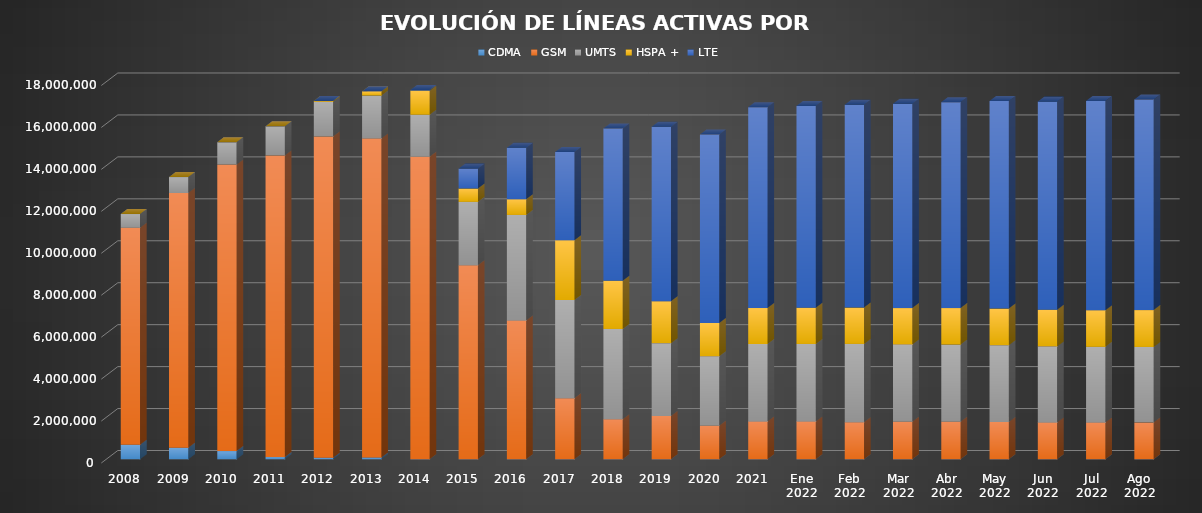
| Category | CDMA | GSM | UMTS | HSPA + | LTE |
|---|---|---|---|---|---|
| 2008 | 688357 | 10346902 | 656989 | 0 | 0 |
| 2009 | 544313 | 12151710 | 758577 | 0 | 0 |
| 2010 | 389834 | 13657394 | 1071603 | 0 | 0 |
| 2011 | 102115 | 14379423 | 1393020 | 0 | 0 |
| 2012 | 75179 | 15310006 | 1658596 | 43082 | 0 |
| 2013 | 83748 | 15215287 | 2043321 | 199398 | 0 |
| 2014 | 3009 | 14418144 | 2006405 | 1148823 | 28176 |
| 2015 | 0 | 9252920 | 3019889 | 636488 | 949723 |
| 2016 | 0 | 6621574 | 5027714 | 748032 | 2450814 |
| 2017 | 0 | 2903370.634 | 4688270.066 | 2852941.199 | 4206822.101 |
| 2018 | 0 | 1909938.891 | 4302462.415 | 2301651 | 7258785.694 |
| 2019 | 0 | 2068130.505 | 3468519.705 | 1995507 | 8320942.79 |
| 2020 | 0 | 1595680.621 | 3315009.099 | 1591073 | 8983603.28 |
| 2021 | 0 | 1804531 | 3688873 | 1717066 | 9579130 |
| Ene 2022 | 0 | 1805568.915 | 3691993.367 | 1724655 | 9625971.718 |
| Feb 2022 | 0 | 1766433.449 | 3732997.987 | 1730603 | 9675803.564 |
| Mar 2022 | 0 | 1788524.686 | 3683797.748 | 1734523 | 9742847.566 |
| Abr 2022 | 0 | 1787551.615 | 3681280.387 | 1738734 | 9820230.999 |
| May 2022 | 0 | 1778055.41 | 3660016.984 | 1744330 | 9902399.607 |
| Jun 2022 | 0 | 1757626.897 | 3624197.892 | 1745386 | 9928728.21 |
| Jul 2022 | 0 | 1753354.905 | 3606713.14 | 1747790 | 9978154.955 |
| Ago 2022 | 0 | 1747992.74 | 3606888.27 | 1755977 | 10044823.989 |